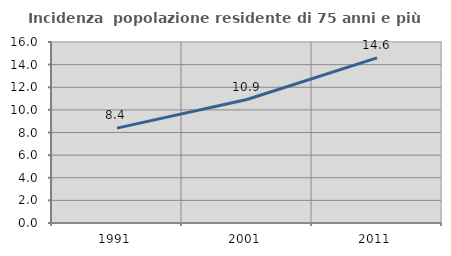
| Category | Incidenza  popolazione residente di 75 anni e più |
|---|---|
| 1991.0 | 8.385 |
| 2001.0 | 10.914 |
| 2011.0 | 14.595 |